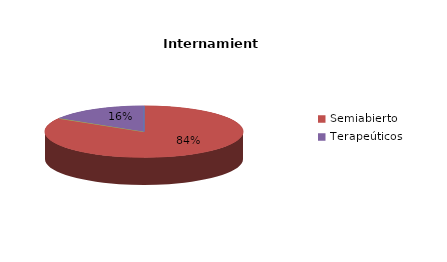
| Category | Series 0 |
|---|---|
| Cerrado | 0 |
| Semiabierto | 41 |
| Abierto | 0 |
| Terapeúticos | 8 |